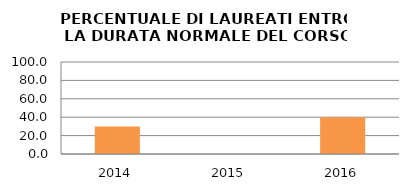
| Category | 2014 2015 2016 |
|---|---|
| 2014.0 | 30 |
| 2015.0 | 0 |
| 2016.0 | 40 |